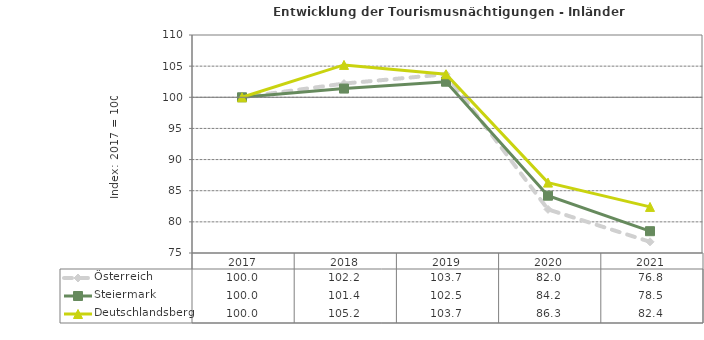
| Category | Österreich | Steiermark | Deutschlandsberg |
|---|---|---|---|
| 2021.0 | 76.8 | 78.5 | 82.4 |
| 2020.0 | 82 | 84.2 | 86.3 |
| 2019.0 | 103.7 | 102.5 | 103.7 |
| 2018.0 | 102.2 | 101.4 | 105.2 |
| 2017.0 | 100 | 100 | 100 |